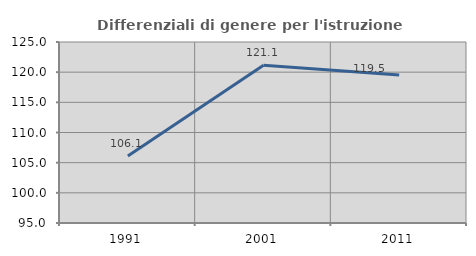
| Category | Differenziali di genere per l'istruzione superiore |
|---|---|
| 1991.0 | 106.091 |
| 2001.0 | 121.135 |
| 2011.0 | 119.529 |